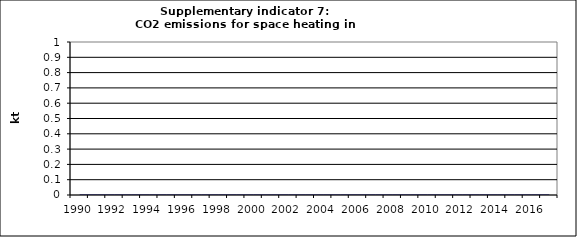
| Category | CO2 emissions for space heating in households, kt |
|---|---|
| 1990 | 0 |
| 1991 | 0 |
| 1992 | 0 |
| 1993 | 0 |
| 1994 | 0 |
| 1995 | 0 |
| 1996 | 0 |
| 1997 | 0 |
| 1998 | 0 |
| 1999 | 0 |
| 2000 | 0 |
| 2001 | 0 |
| 2002 | 0 |
| 2003 | 0 |
| 2004 | 0 |
| 2005 | 0 |
| 2006 | 0 |
| 2007 | 0 |
| 2008 | 0 |
| 2009 | 0 |
| 2010 | 0 |
| 2011 | 0 |
| 2012 | 0 |
| 2013 | 0 |
| 2014 | 0 |
| 2015 | 0 |
| 2016 | 0 |
| 2017 | 0 |